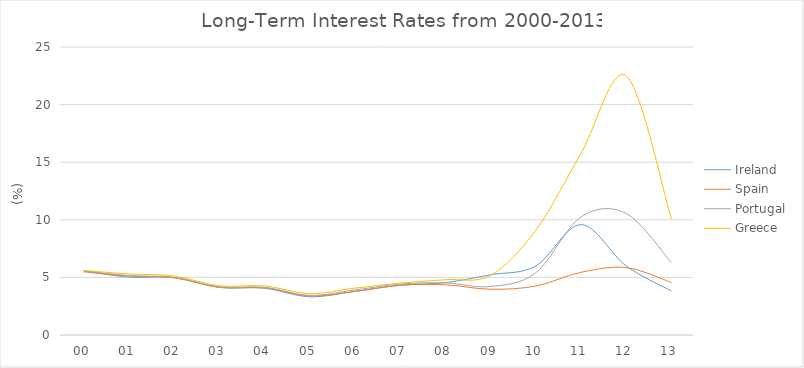
| Category | Ireland | Spain | Portugal | Greece |
|---|---|---|---|---|
| 00 | 5.57 | 5.48 | 5.58 | 5.6 |
| 01 | 5.02 | 5.12 | 5.16 | 5.3 |
| 02 | 4.99 | 4.96 | 5.01 | 5.12 |
| 03 | 4.13 | 4.13 | 4.18 | 4.27 |
| 04 | 4.06 | 4.1 | 4.14 | 4.26 |
| 05 | 3.32 | 3.39 | 3.44 | 3.59 |
| 06 | 3.79 | 3.78 | 3.91 | 4.07 |
| 07 | 4.33 | 4.31 | 4.42 | 4.5 |
| 08 | 4.55 | 4.36 | 4.52 | 4.8 |
| 09 | 5.23 | 3.97 | 4.21 | 5.17 |
| 10 | 5.99 | 4.25 | 5.4 | 9.09 |
| 11 | 9.58 | 5.44 | 10.24 | 15.75 |
| 12 | 5.99 | 5.85 | 10.55 | 22.5 |
| 13 | 3.83 | 4.56 | 6.29 | 10.05 |